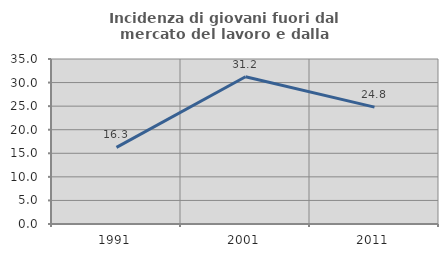
| Category | Incidenza di giovani fuori dal mercato del lavoro e dalla formazione  |
|---|---|
| 1991.0 | 16.268 |
| 2001.0 | 31.239 |
| 2011.0 | 24.797 |